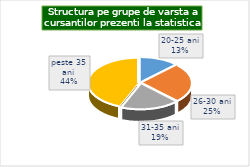
| Category | Series 0 |
|---|---|
| 20-25 ani | 12.5 |
| 26-30 ani | 25 |
| 31-35 ani | 18.75 |
| peste 35 ani | 43.75 |